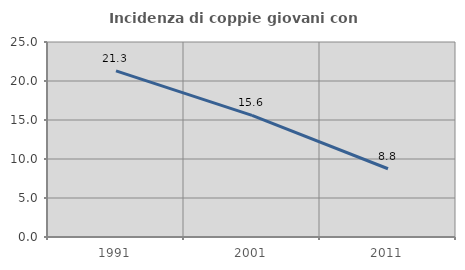
| Category | Incidenza di coppie giovani con figli |
|---|---|
| 1991.0 | 21.305 |
| 2001.0 | 15.596 |
| 2011.0 | 8.752 |